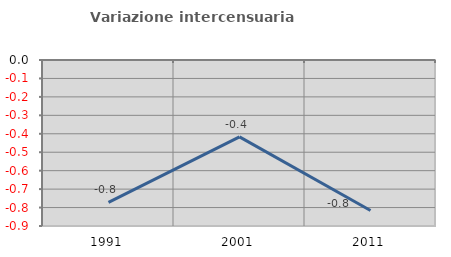
| Category | Variazione intercensuaria annua |
|---|---|
| 1991.0 | -0.772 |
| 2001.0 | -0.417 |
| 2011.0 | -0.816 |